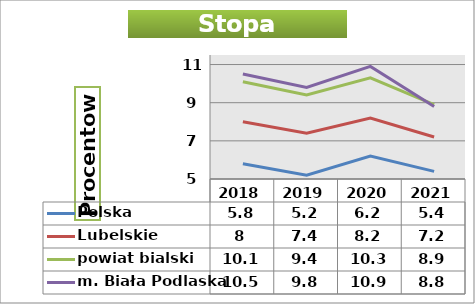
| Category | Polska | Lubelskie | powiat bialski | m. Biała Podlaska |
|---|---|---|---|---|
| 2018.0 | 5.8 | 8 | 10.1 | 10.5 |
| 2019.0 | 5.2 | 7.4 | 9.4 | 9.8 |
| 2020.0 | 6.2 | 8.2 | 10.3 | 10.9 |
| 2021.0 | 5.4 | 7.2 | 8.9 | 8.8 |